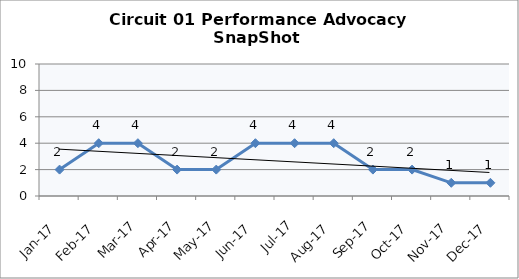
| Category | Circuit 01 |
|---|---|
| Jan-17 | 2 |
| Feb-17 | 4 |
| Mar-17 | 4 |
| Apr-17 | 2 |
| May-17 | 2 |
| Jun-17 | 4 |
| Jul-17 | 4 |
| Aug-17 | 4 |
| Sep-17 | 2 |
| Oct-17 | 2 |
| Nov-17 | 1 |
| Dec-17 | 1 |